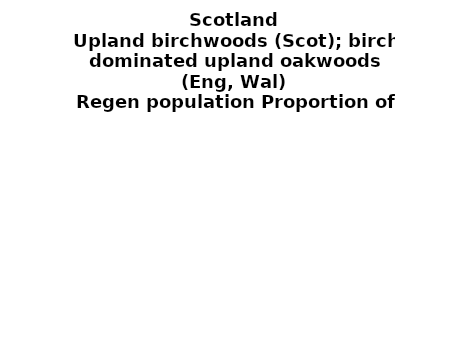
| Category | Upland birchwoods (Scot); birch dominated upland oakwoods (Eng, Wal) |
|---|---|
| None | 0.076 |
| Seedlings only | 0 |
| Seedlings, saplings only | 0.037 |
| Seedlings, saplings, <7 cm trees | 0.148 |
| Saplings only | 0.181 |
| <7 cm trees, seedlings only | 0 |
| <7 cm trees, saplings only | 0.431 |
| <7 cm Trees only | 0.127 |